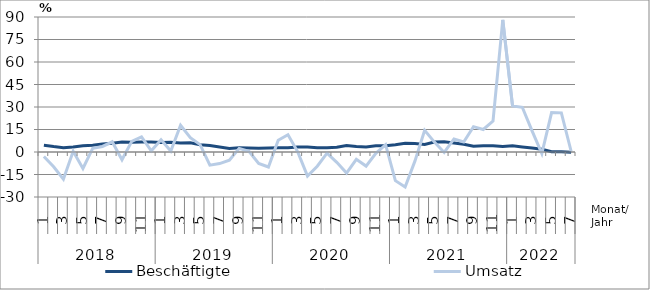
| Category | Beschäftigte | Umsatz |
|---|---|---|
| 0 | 4.5 | -3 |
| 1 | 3.6 | -9.8 |
| 2 | 2.9 | -18.1 |
| 3 | 3.4 | 0.5 |
| 4 | 4.2 | -11 |
| 5 | 4.5 | 2.5 |
| 6 | 5.3 | 3.7 |
| 7 | 5.8 | 6.8 |
| 8 | 6.6 | -5.2 |
| 9 | 6.5 | 7.1 |
| 10 | 6.6 | 10.1 |
| 11 | 6.6 | 0.8 |
| 12 | 6.4 | 8.2 |
| 13 | 6.5 | 0.6 |
| 14 | 6 | 17.8 |
| 15 | 6.1 | 9.6 |
| 16 | 4.9 | 4.9 |
| 17 | 4.3 | -8.8 |
| 18 | 3.3 | -7.7 |
| 19 | 2.4 | -5.4 |
| 20 | 2.8 | 2.4 |
| 21 | 2.7 | 0.5 |
| 22 | 2.5 | -7.6 |
| 23 | 2.7 | -10 |
| 24 | 2.9 | 7.8 |
| 25 | 2.9 | 11.5 |
| 26 | 3.4 | 0.1 |
| 27 | 3.4 | -16.1 |
| 28 | 2.9 | -9.5 |
| 29 | 2.9 | -0.8 |
| 30 | 3.1 | -6.9 |
| 31 | 4.3 | -14 |
| 32 | 3.6 | -4.9 |
| 33 | 3.4 | -9.4 |
| 34 | 4.1 | -0.9 |
| 35 | 4.1 | 4.9 |
| 36 | 4.8 | -19.1 |
| 37 | 5.8 | -23.3 |
| 38 | 5.6 | -6.1 |
| 39 | 5 | 14.4 |
| 40 | 6.6 | 6.6 |
| 41 | 6.9 | -0.3 |
| 42 | 6 | 8.7 |
| 43 | 5.2 | 6.7 |
| 44 | 3.8 | 16.9 |
| 45 | 4.2 | 15 |
| 46 | 4.2 | 20.6 |
| 47 | 3.7 | 88.1 |
| 48 | 4.1 | 30.7 |
| 49 | 3.4 | 29.8 |
| 50 | 2.6 | 14.1 |
| 51 | 1.9 | -1 |
| 52 | 0.2 | 26.3 |
| 53 | 0.2 | 26.1 |
| 54 | -0.2 | 0.5 |